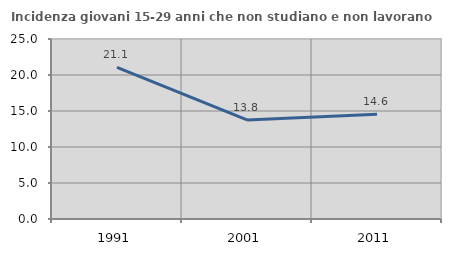
| Category | Incidenza giovani 15-29 anni che non studiano e non lavorano  |
|---|---|
| 1991.0 | 21.053 |
| 2001.0 | 13.766 |
| 2011.0 | 14.557 |